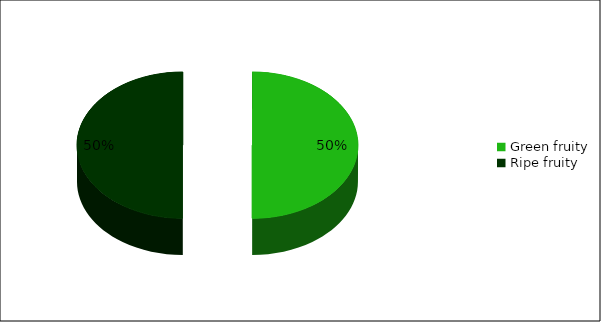
| Category | Number of judge |
|---|---|
| Green fruity | 4 |
| Ripe fruity | 4 |